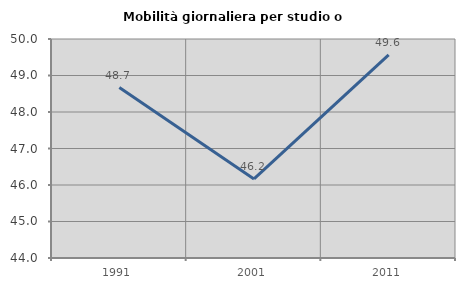
| Category | Mobilità giornaliera per studio o lavoro |
|---|---|
| 1991.0 | 48.67 |
| 2001.0 | 46.168 |
| 2011.0 | 49.563 |